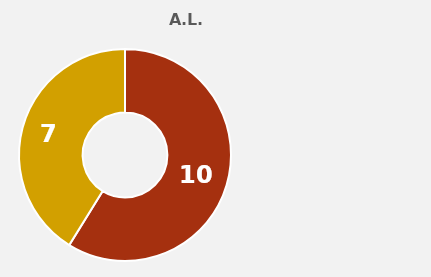
| Category | A.L. CANDELARIA |
|---|---|
| PQRS Vencidas | 10 |
| PQRS con Respuesta Exemporánea | 7 |